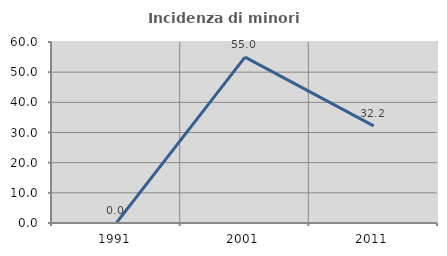
| Category | Incidenza di minori stranieri |
|---|---|
| 1991.0 | 0 |
| 2001.0 | 55 |
| 2011.0 | 32.203 |